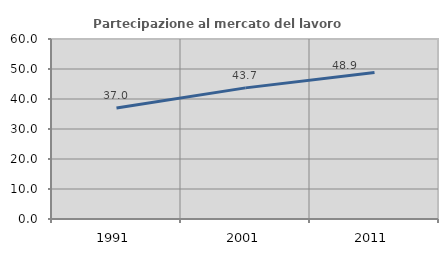
| Category | Partecipazione al mercato del lavoro  femminile |
|---|---|
| 1991.0 | 36.98 |
| 2001.0 | 43.711 |
| 2011.0 | 48.85 |